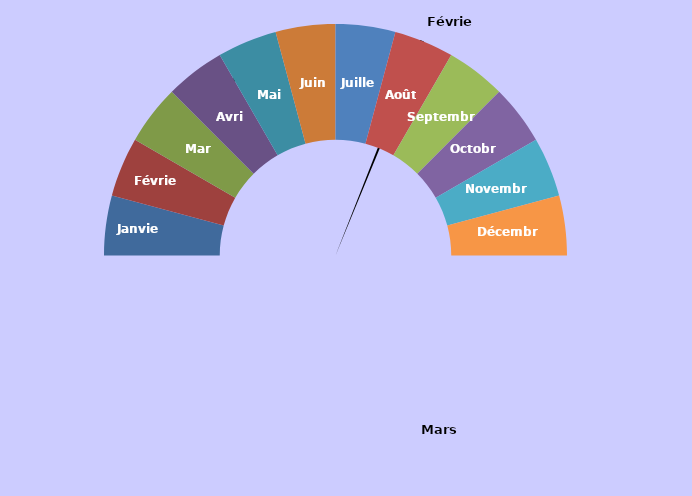
| Category | Series 1 |
|---|---|
| nan | 226 |
| 15.0 | 2 |
| nan | 502 |